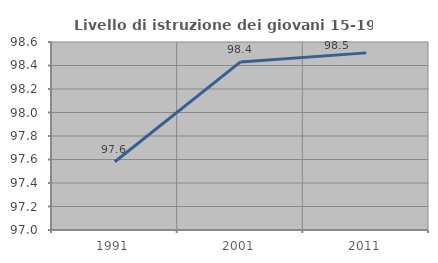
| Category | Livello di istruzione dei giovani 15-19 anni |
|---|---|
| 1991.0 | 97.581 |
| 2001.0 | 98.43 |
| 2011.0 | 98.507 |